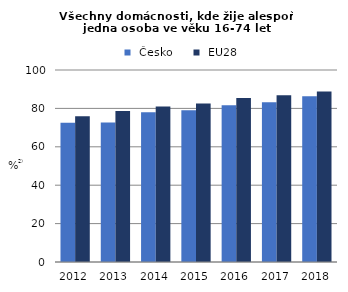
| Category |  Česko |  EU28 |
|---|---|---|
| 2012.0 | 72.55 | 75.9 |
| 2013.0 | 72.6 | 78.6 |
| 2014.0 | 78 | 81 |
| 2015.0 | 79 | 82.6 |
| 2016.0 | 81.7 | 85.4 |
| 2017.0 | 83.235 | 86.859 |
| 2018.0 | 86.357 | 88.758 |